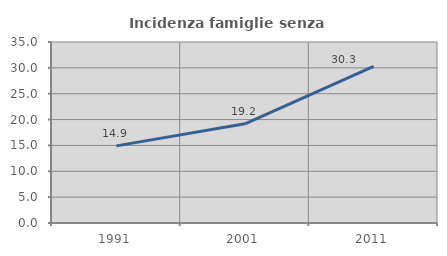
| Category | Incidenza famiglie senza nuclei |
|---|---|
| 1991.0 | 14.911 |
| 2001.0 | 19.19 |
| 2011.0 | 30.309 |